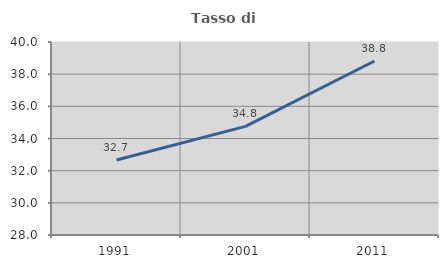
| Category | Tasso di occupazione   |
|---|---|
| 1991.0 | 32.662 |
| 2001.0 | 34.752 |
| 2011.0 | 38.821 |